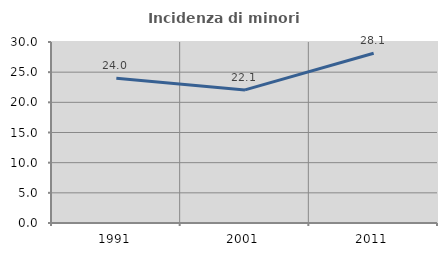
| Category | Incidenza di minori stranieri |
|---|---|
| 1991.0 | 24 |
| 2001.0 | 22.059 |
| 2011.0 | 28.144 |